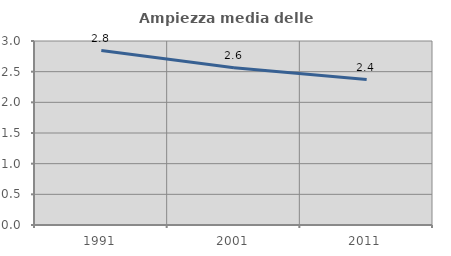
| Category | Ampiezza media delle famiglie |
|---|---|
| 1991.0 | 2.845 |
| 2001.0 | 2.563 |
| 2011.0 | 2.371 |